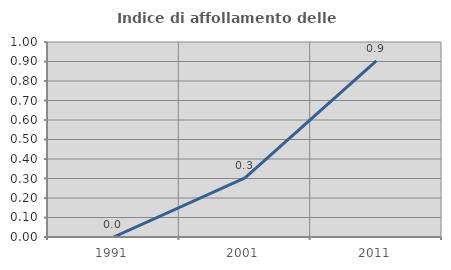
| Category | Indice di affollamento delle abitazioni  |
|---|---|
| 1991.0 | 0 |
| 2001.0 | 0.303 |
| 2011.0 | 0.904 |